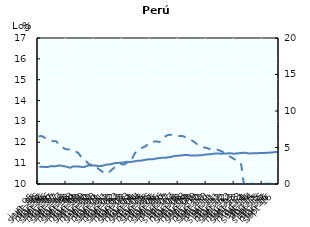
| Category | Tendencia |
|---|---|
| 0 | 10.813 |
| Jan-00 | 10.831 |
| Jan-00 | 10.809 |
| Jan-00 | 10.819 |
| Jan-00 | 10.848 |
| Jan-00 | 10.847 |
| Jan-00 | 10.857 |
| Jan-00 | 10.894 |
| Jan-00 | 10.869 |
| Jan-00 | 10.847 |
| Jan-00 | 10.816 |
| Jan-00 | 10.782 |
| Jan-00 | 10.841 |
| Jan-00 | 10.841 |
| Jan-00 | 10.84 |
| Jan-00 | 10.817 |
| Jan-00 | 10.811 |
| Jan-00 | 10.872 |
| Jan-00 | 10.891 |
| Jan-00 | 10.882 |
| Jan-00 | 10.884 |
| Jan-00 | 10.863 |
| Jan-00 | 10.862 |
| Jan-00 | 10.893 |
| Jan-00 | 10.931 |
| Jan-00 | 10.942 |
| Jan-00 | 10.968 |
| Jan-00 | 10.999 |
| Jan-00 | 11.01 |
| Jan-00 | 11.023 |
| Jan-00 | 11.028 |
| Jan-00 | 11.061 |
| Feb-00 | 11.058 |
| Feb-00 | 11.065 |
| Feb-00 | 11.089 |
| Feb-00 | 11.115 |
| Feb-00 | 11.114 |
| Feb-00 | 11.141 |
| Feb-00 | 11.165 |
| Feb-00 | 11.183 |
| Feb-00 | 11.182 |
| Feb-00 | 11.201 |
| Feb-00 | 11.23 |
| Feb-00 | 11.244 |
| Feb-00 | 11.258 |
| Feb-00 | 11.261 |
| Feb-00 | 11.282 |
| Feb-00 | 11.298 |
| Feb-00 | 11.336 |
| Feb-00 | 11.355 |
| Feb-00 | 11.361 |
| Feb-00 | 11.377 |
| Feb-00 | 11.39 |
| Feb-00 | 11.387 |
| Feb-00 | 11.364 |
| Feb-00 | 11.367 |
| Feb-00 | 11.367 |
| Feb-00 | 11.376 |
| Feb-00 | 11.379 |
| Feb-00 | 11.41 |
| Feb-00 | 11.42 |
| Mar-00 | 11.428 |
| Mar-00 | 11.453 |
| Mar-00 | 11.457 |
| Mar-00 | 11.46 |
| Mar-00 | 11.454 |
| Mar-00 | 11.464 |
| Mar-00 | 11.462 |
| Mar-00 | 11.477 |
| Mar-00 | 11.457 |
| Mar-00 | 11.457 |
| Mar-00 | 11.474 |
| Mar-00 | 11.487 |
| Mar-00 | 11.502 |
| Mar-00 | 11.483 |
| Mar-00 | 11.464 |
| Mar-00 | 11.472 |
| Mar-00 | 11.473 |
| Mar-00 | 11.478 |
| Mar-00 | 11.488 |
| Mar-00 | 11.486 |
| Mar-00 | 11.498 |
| Mar-00 | 11.502 |
| Mar-00 | 11.51 |
| Mar-00 | 11.531 |
| Mar-00 | 11.529 |